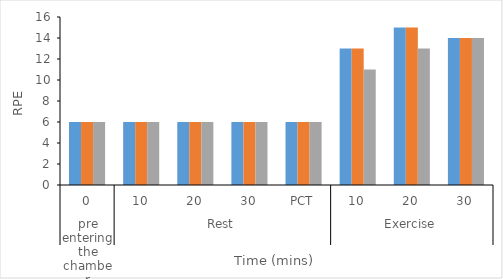
| Category | Water | Control | Menthol  |
|---|---|---|---|
| 0 | 6 | 6 | 6 |
| 1 | 6 | 6 | 6 |
| 2 | 6 | 6 | 6 |
| 3 | 6 | 6 | 6 |
| 4 | 6 | 6 | 6 |
| 5 | 13 | 13 | 11 |
| 6 | 15 | 15 | 13 |
| 7 | 14 | 14 | 14 |